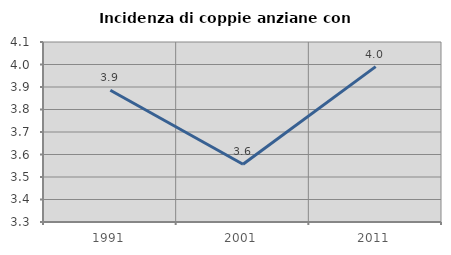
| Category | Incidenza di coppie anziane con figli |
|---|---|
| 1991.0 | 3.885 |
| 2001.0 | 3.556 |
| 2011.0 | 3.991 |